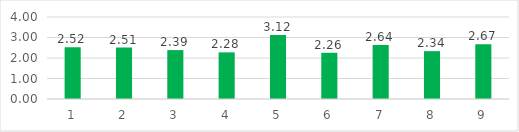
| Category | Series 0 |
|---|---|
| 0 | 2.52 |
| 1 | 2.51 |
| 2 | 2.385 |
| 3 | 2.275 |
| 4 | 3.12 |
| 5 | 2.255 |
| 6 | 2.64 |
| 7 | 2.335 |
| 8 | 2.665 |